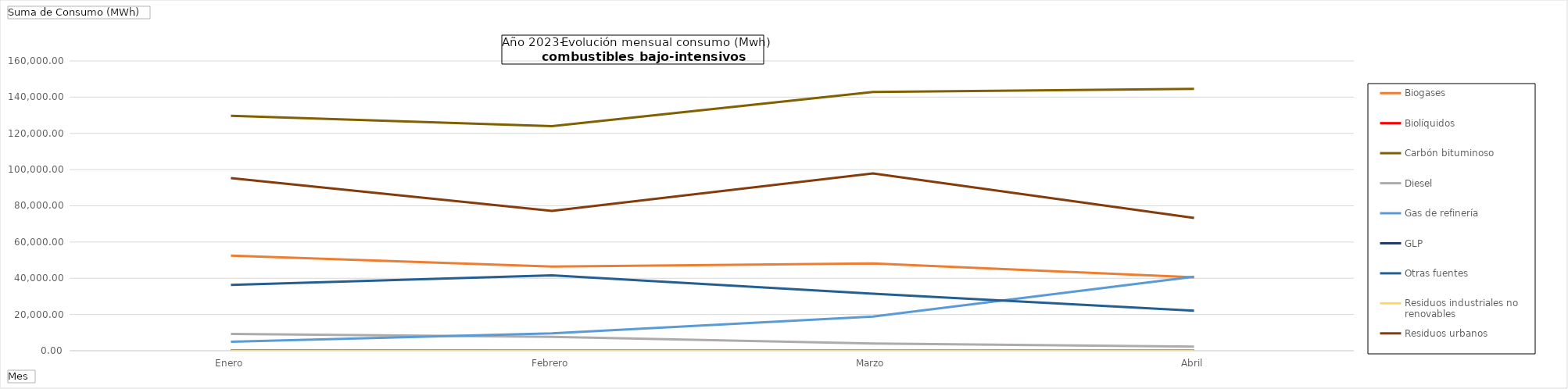
| Category | Biogases | Biolíquidos | Carbón bituminoso | Diesel | Gas de refinería | GLP | Otras fuentes | Residuos industriales no renovables | Residuos urbanos |
|---|---|---|---|---|---|---|---|---|---|
| Enero | 52533.57 | 0 | 129726.75 | 9237.79 | 4928 | 96.44 | 36311.23 | 0 | 95267.56 |
| Febrero | 46521.54 | 0 | 124036.52 | 7705.24 | 9588 | 0 | 41665.46 | 0 | 77225.74 |
| Marzo | 48191.15 | 0 | 142890.95 | 3965.1 | 18904 | 0 | 31442.46 | 0 | 97866.23 |
| Abril | 40529.89 | 0 | 144630.49 | 2306.5 | 40849.1 | 0 | 22105 | 0 | 73269.18 |